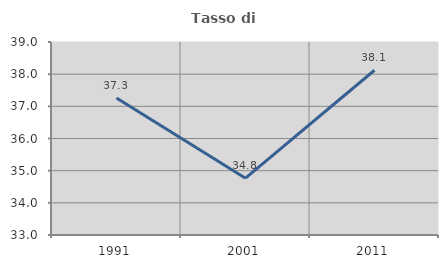
| Category | Tasso di occupazione   |
|---|---|
| 1991.0 | 37.257 |
| 2001.0 | 34.767 |
| 2011.0 | 38.122 |